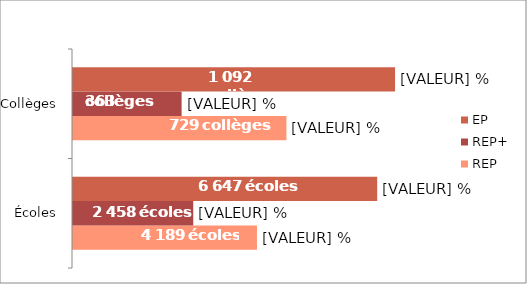
| Category | REP | REP+ | EP |
|---|---|---|---|
| Écoles | 12.297 | 8.038 | 20.335 |
| Collèges | 14.267 | 7.261 | 21.528 |